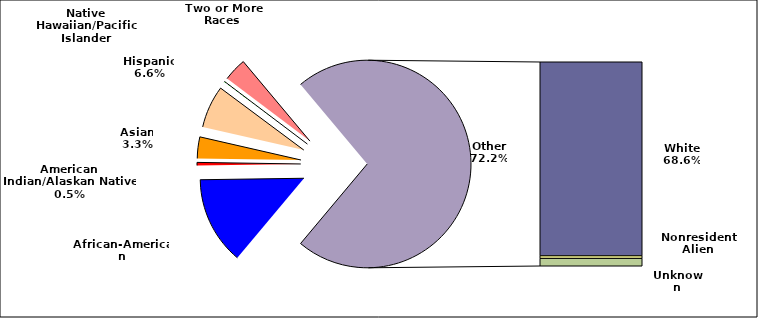
| Category | Total Institutional Enrollment |
|---|---|
| African-American | 0.137 |
| American Indian/Alaskan Native | 0.005 |
| Asian | 0.033 |
| Hispanic  | 0.066 |
| Native Hawaiian/Pacific Islander | 0.001 |
| Two or More Races | 0.036 |
| White | 0.686 |
| Nonresident Alien | 0.009 |
| Unknown | 0.027 |